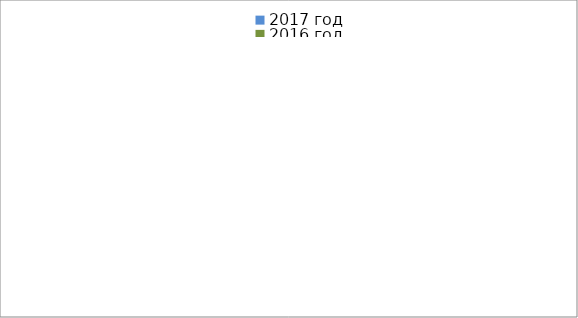
| Category | 2017 год | 2016 год |
|---|---|---|
|  - поджог | 3 | 4 |
|  - неосторожное обращение с огнём | 2 | 1 |
|  - НПТЭ электрооборудования | 7 | 3 |
|  - НПУ и Э печей | 25 | 17 |
|  - НПУ и Э транспортных средств | 17 | 18 |
|   -Шалость с огнем детей | 1 | 1 |
|  -НППБ при эксплуатации эл.приборов | 10 | 12 |
|  - курение | 10 | 10 |
| - прочие | 16 | 25 |
| - не установленные причины | 0 | 0 |